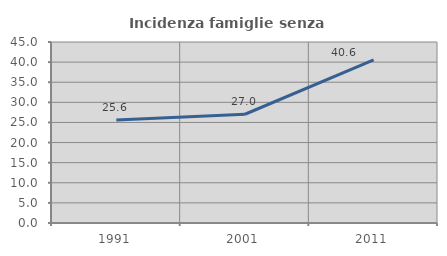
| Category | Incidenza famiglie senza nuclei |
|---|---|
| 1991.0 | 25.6 |
| 2001.0 | 27.039 |
| 2011.0 | 40.551 |